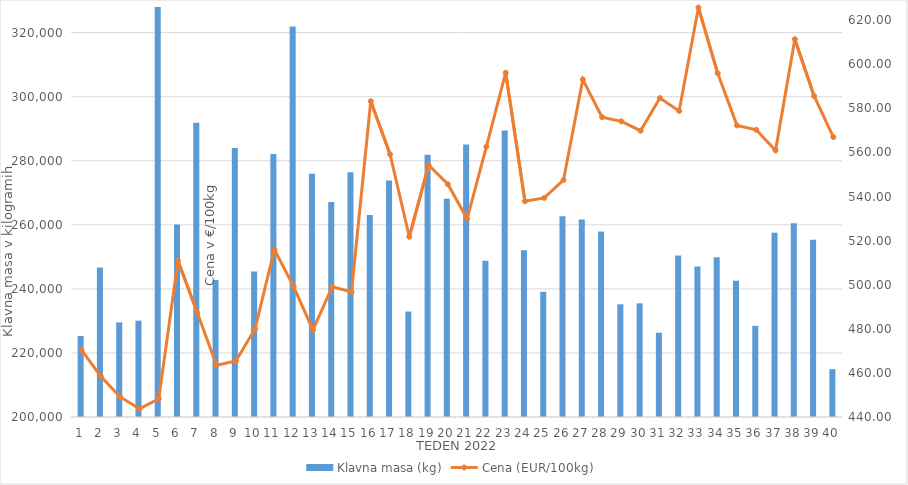
| Category | Klavna masa (kg) |
|---|---|
| 1.0 | 225300 |
| 2.0 | 246712 |
| 3.0 | 229541 |
| 4.0 | 230074 |
| 5.0 | 328640 |
| 6.0 | 260108 |
| 7.0 | 291887 |
| 8.0 | 242732 |
| 9.0 | 283987 |
| 10.0 | 245414 |
| 11.0 | 282092 |
| 12.0 | 321936 |
| 13.0 | 275950 |
| 14.0 | 267148 |
| 15.0 | 276417 |
| 16.0 | 263098 |
| 17.0 | 273824 |
| 18.0 | 232926 |
| 19.0 | 281859 |
| 20.0 | 268153 |
| 21.0 | 285073 |
| 22.0 | 248783 |
| 23.0 | 289478 |
| 24.0 | 252069 |
| 25.0 | 239099 |
| 26.0 | 262689 |
| 27.0 | 261656 |
| 28.0 | 257905 |
| 29.0 | 235185 |
| 30.0 | 235475 |
| 31.0 | 226322 |
| 32.0 | 250418 |
| 33.0 | 246996 |
| 34.0 | 249873 |
| 35.0 | 242516 |
| 36.0 | 228469 |
| 37.0 | 257511 |
| 38.0 | 260481 |
| 39.0 | 255370 |
| 40.0 | 214936 |